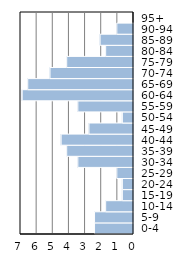
| Category | Series 0 |
|---|---|
| 0-4 | 2.414 |
| 5-9 | 2.414 |
| 10-14 | 1.724 |
| 15-19 | 0.69 |
| 20-24 | 0.69 |
| 25-29 | 1.034 |
| 30-34 | 3.448 |
| 35-39 | 4.138 |
| 40-44 | 4.483 |
| 45-49 | 2.759 |
| 50-54 | 0.69 |
| 55-59 | 3.448 |
| 60-64 | 6.897 |
| 65-69 | 6.552 |
| 70-74 | 5.172 |
| 75-79 | 4.138 |
| 80-84 | 1.724 |
| 85-89 | 2.069 |
| 90-94 | 1.034 |
| 95+ | 0 |